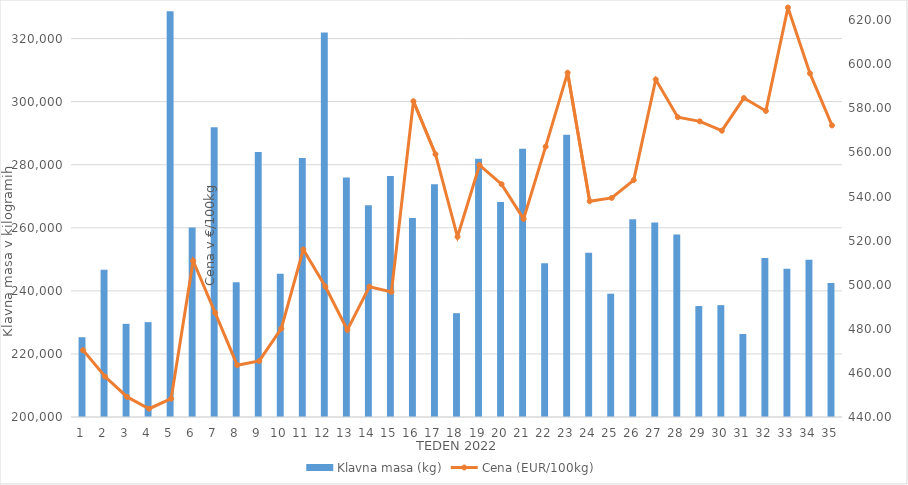
| Category | Klavna masa (kg) |
|---|---|
| 1.0 | 225300 |
| 2.0 | 246712 |
| 3.0 | 229541 |
| 4.0 | 230074 |
| 5.0 | 328640 |
| 6.0 | 260108 |
| 7.0 | 291887 |
| 8.0 | 242732 |
| 9.0 | 283987 |
| 10.0 | 245414 |
| 11.0 | 282092 |
| 12.0 | 321936 |
| 13.0 | 275950 |
| 14.0 | 267148 |
| 15.0 | 276417 |
| 16.0 | 263098 |
| 17.0 | 273824 |
| 18.0 | 232926 |
| 19.0 | 281859 |
| 20.0 | 268153 |
| 21.0 | 285073 |
| 22.0 | 248783 |
| 23.0 | 289478 |
| 24.0 | 252069 |
| 25.0 | 239099 |
| 26.0 | 262689 |
| 27.0 | 261656 |
| 28.0 | 257905 |
| 29.0 | 235185 |
| 30.0 | 235475 |
| 31.0 | 226322 |
| 32.0 | 250418 |
| 33.0 | 246996 |
| 34.0 | 249873 |
| 35.0 | 242516 |